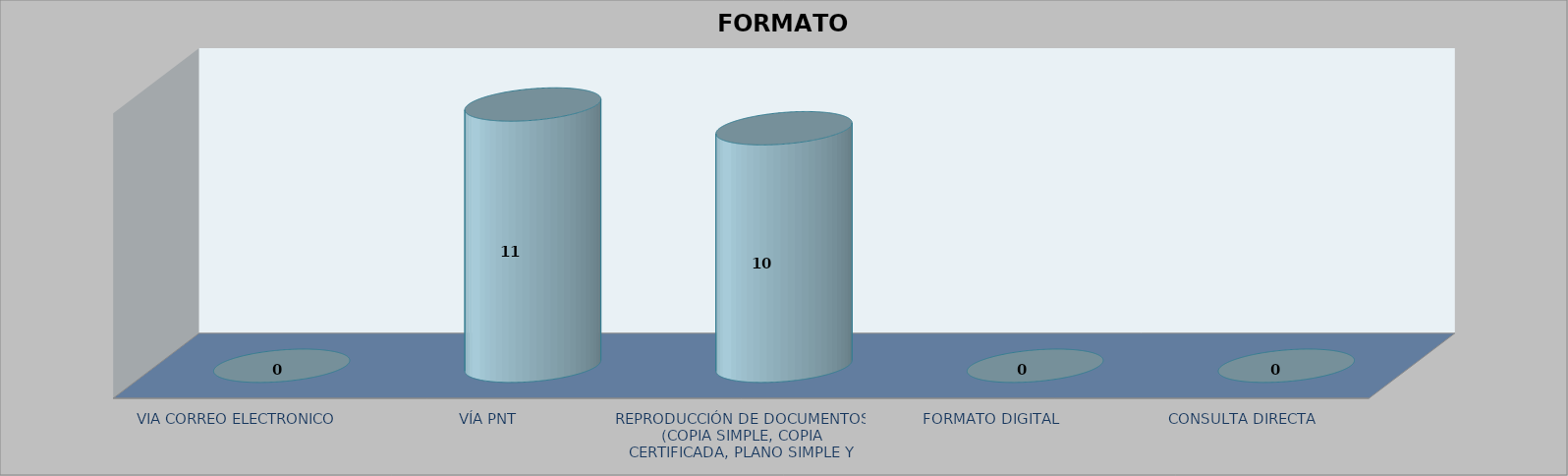
| Category |        FORMATO SOLICITADO | Series 1 | Series 2 |
|---|---|---|---|
| VIA CORREO ELECTRONICO |  |  | 0 |
| VÍA PNT |  |  | 11 |
| REPRODUCCIÓN DE DOCUMENTOS (COPIA SIMPLE, COPIA CERTIFICADA, PLANO SIMPLE Y PLANO CERTIFICADO) |  |  | 10 |
| FORMATO DIGITAL |  |  | 0 |
| CONSULTA DIRECTA |  |  | 0 |